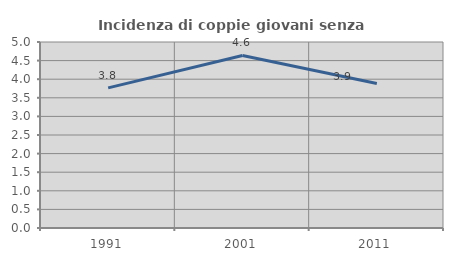
| Category | Incidenza di coppie giovani senza figli |
|---|---|
| 1991.0 | 3.766 |
| 2001.0 | 4.639 |
| 2011.0 | 3.883 |